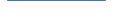
| Category | Series 0 |
|---|---|
| 0 | 144 |
| 1 | 101 |
| 2 | 118 |
| 3 | 106 |
| 4 | 112 |
| 5 | 109 |
| 6 | 93 |
| 7 | 100 |
| 8 | 117 |